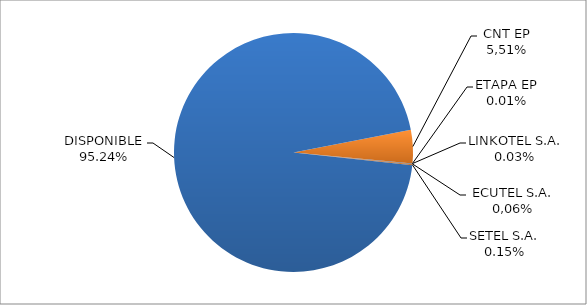
| Category | CODIGO DE AREA 5 |
|---|---|
| CORPORACIÓN NACIONAL TELECOMUNICACIONES CNT EP | 0.045 |
| ETAPA EP | 0 |
| LINKOTEL S.A. | 0 |
| CONECEL S.A. (ECUADORTELECOM S.A.) | 0.001 |
| SETEL S.A. | 0.002 |
| DISPONIBLE | 0.952 |